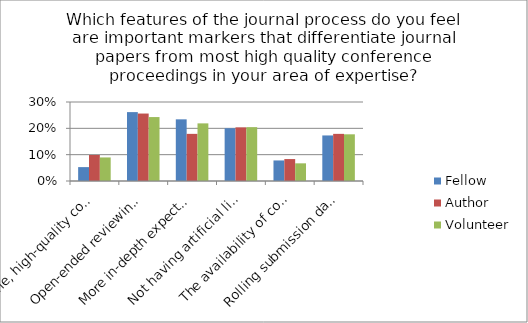
| Category | Fellow | Author | Volunteer |
|---|---|---|---|
| None, high-quality conference papers are essentially the same as journal papers | 0.053 | 0.099 | 0.089 |
| Open-ended reviewing with multiple revisions and re-reviews | 0.262 | 0.256 | 0.243 |
| More in-depth expectations for reviewers and reviewing | 0.234 | 0.179 | 0.219 |
| Not having artificial limits on the length of papers | 0.2 | 0.204 | 0.204 |
| The availability of copy-editing to improve presentation and layout | 0.078 | 0.083 | 0.067 |
| Rolling submission dates rather than fixed deadlines | 0.173 | 0.179 | 0.177 |